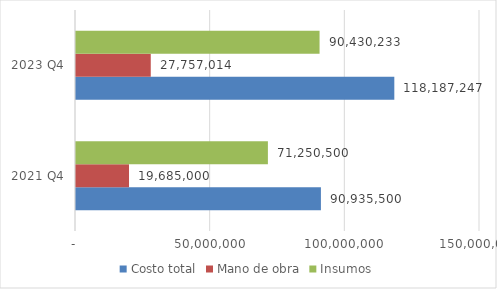
| Category | Costo total | Mano de obra | Insumos |
|---|---|---|---|
| 2021 Q4 | 90935500 | 19685000 | 71250500 |
| 2023 Q4 | 118187247.042 | 27757014 | 90430233.042 |